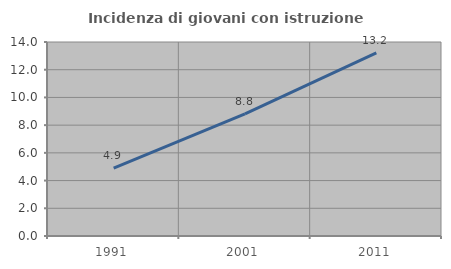
| Category | Incidenza di giovani con istruzione universitaria |
|---|---|
| 1991.0 | 4.902 |
| 2001.0 | 8.808 |
| 2011.0 | 13.208 |